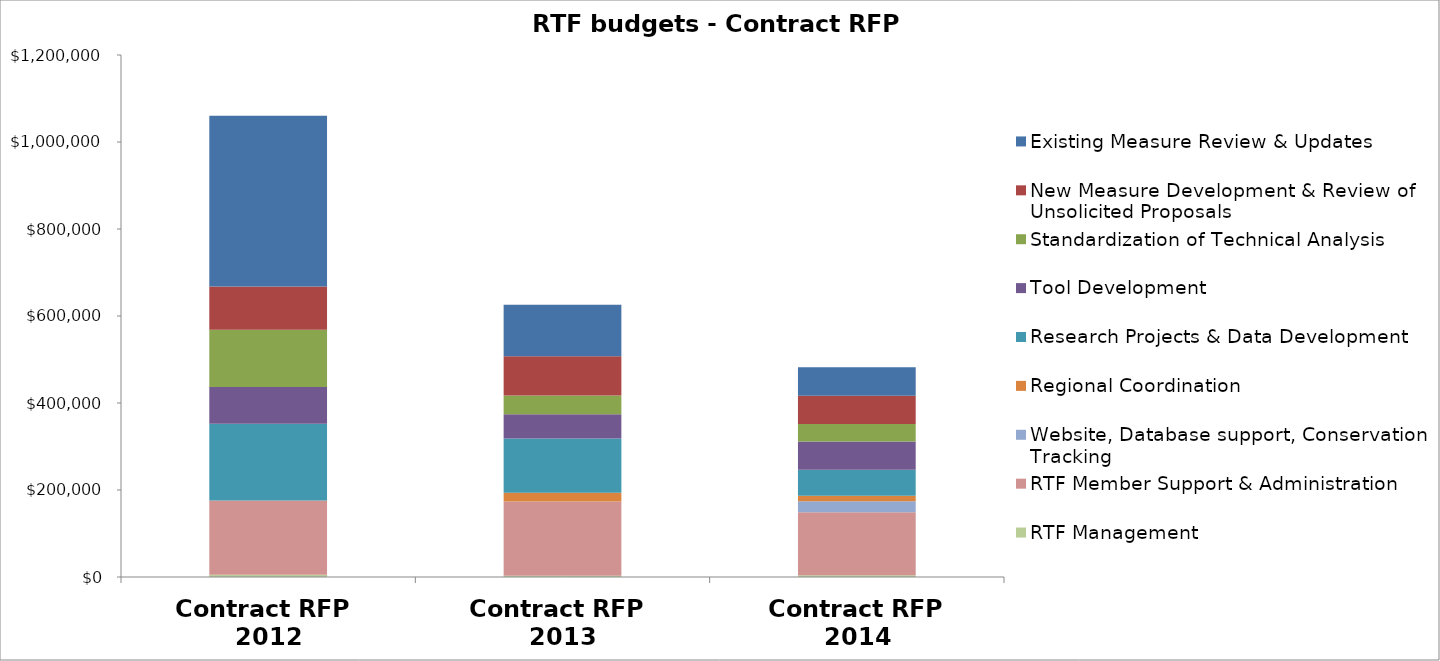
| Category | RTF Management | RTF Member Support & Administration | Website, Database support, Conservation Tracking  | Regional Coordination | Research Projects & Data Development | Tool Development | Standardization of Technical Analysis | New Measure Development & Review of Unsolicited Proposals | Existing Measure Review & Updates |
|---|---|---|---|---|---|---|---|---|---|
| Contract RFP 
2012 | 4910 | 170868 | 0 | 0 | 176760 | 84452 | 131588 | 99182 | 392800 |
| Contract RFP 
2013 | 2946 | 170868 | 0 | 19640 | 124714 | 55974 | 43208 | 90344 | 118331 |
| Contract RFP
2014 | 4000 | 145000 | 25000 | 12500 | 60000 | 65000 | 40000 | 65000 | 65500 |